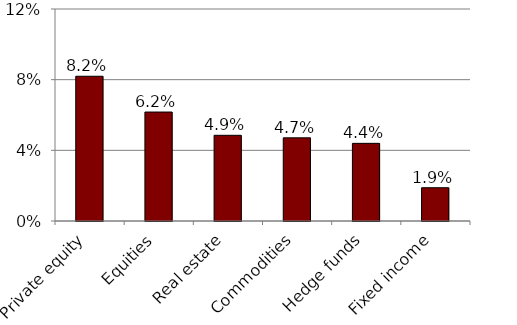
| Category | Post-Recession |
|---|---|
| Private equity | 8.193 |
| Equities | 6.168 |
| Real estate | 4.851 |
| Commodities | 4.708 |
| Hedge funds | 4.395 |
| Fixed income | 1.883 |